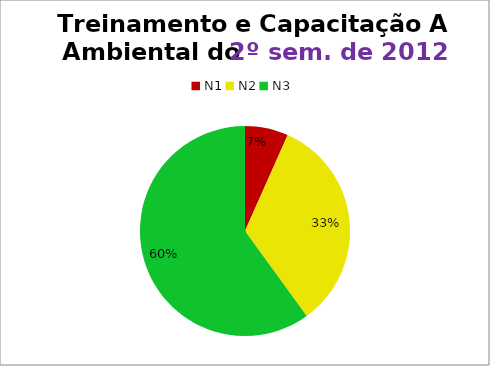
| Category | 2º/12 |
|---|---|
| N1 | 2 |
| N2 | 10 |
| N3 | 18 |